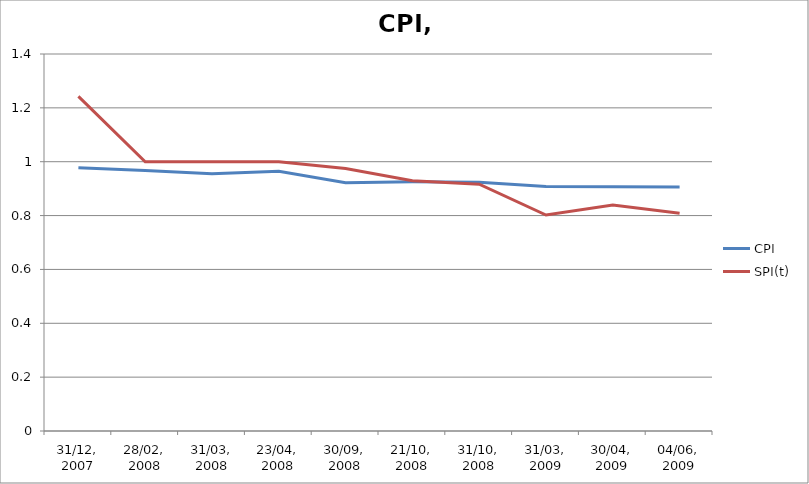
| Category | CPI | SPI(t) |
|---|---|---|
| 31/12, 2007 | 0.978 | 1.243 |
| 28/02, 2008 | 0.967 | 1 |
| 31/03, 2008 | 0.955 | 1 |
| 23/04, 2008 | 0.965 | 1 |
| 30/09, 2008 | 0.922 | 0.975 |
| 21/10, 2008 | 0.925 | 0.93 |
| 31/10, 2008 | 0.923 | 0.917 |
| 31/03, 2009 | 0.908 | 0.802 |
| 30/04, 2009 | 0.907 | 0.839 |
| 04/06, 2009 | 0.906 | 0.808 |